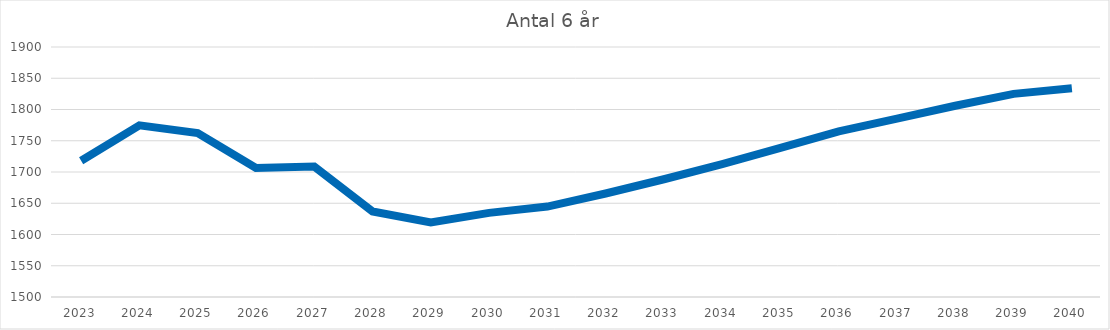
| Category | Antal 6 år |
|---|---|
| 2023.0 | 1718 |
| 2024.0 | 1774.672 |
| 2025.0 | 1762.327 |
| 2026.0 | 1706.366 |
| 2027.0 | 1708.74 |
| 2028.0 | 1636.901 |
| 2029.0 | 1619.234 |
| 2030.0 | 1634.653 |
| 2031.0 | 1644.694 |
| 2032.0 | 1665.606 |
| 2033.0 | 1688.405 |
| 2034.0 | 1712.747 |
| 2035.0 | 1738.581 |
| 2036.0 | 1765.009 |
| 2037.0 | 1785.472 |
| 2038.0 | 1806.015 |
| 2039.0 | 1824.984 |
| 2040.0 | 1834.16 |